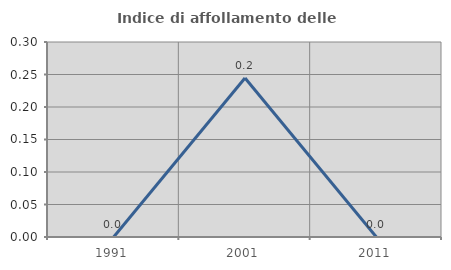
| Category | Indice di affollamento delle abitazioni  |
|---|---|
| 1991.0 | 0 |
| 2001.0 | 0.244 |
| 2011.0 | 0 |